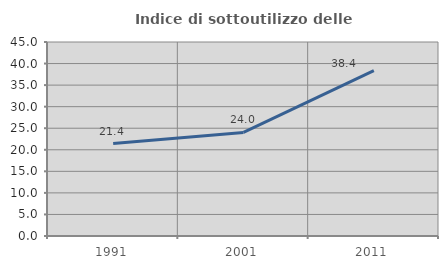
| Category | Indice di sottoutilizzo delle abitazioni  |
|---|---|
| 1991.0 | 21.429 |
| 2001.0 | 24.027 |
| 2011.0 | 38.365 |